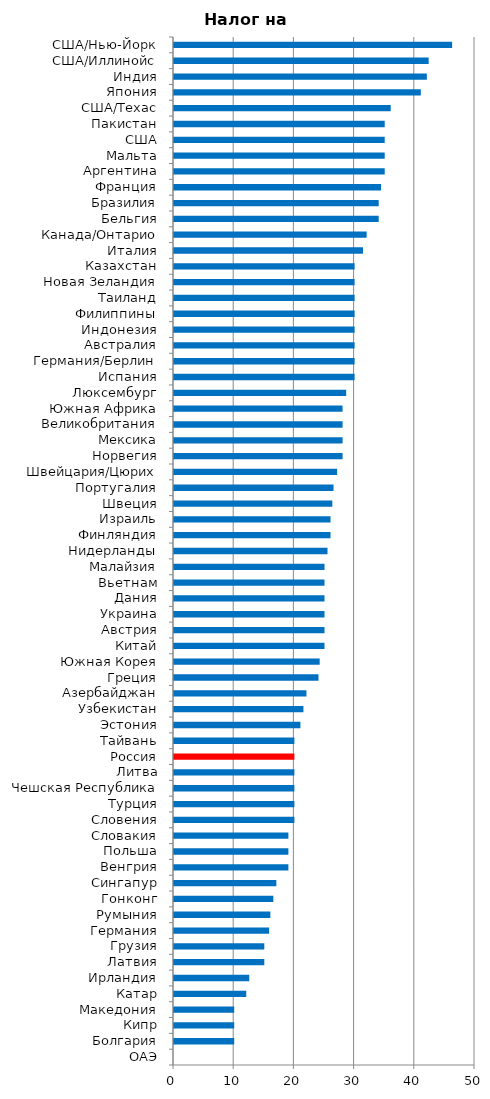
| Category | Налог на прибыль |
|---|---|
| ОАЭ | 0 |
| Болгария | 10 |
| Кипр | 10 |
| Македония | 10 |
| Катар | 12 |
| Ирландия | 12.5 |
| Латвия | 15 |
| Грузия | 15 |
| Германия | 15.8 |
| Румыния | 16 |
| Гонконг | 16.5 |
| Сингапур | 17 |
| Венгрия | 19 |
| Польша | 19 |
| Словакия | 19 |
| Словения | 20 |
| Турция | 20 |
| Чешская Республика | 20 |
| Литва | 20 |
| Россия | 20 |
| Тайвань | 20 |
| Эстония | 21 |
| Узбекистан | 21.5 |
| Азербайджан | 22 |
| Греция | 24 |
| Южная Корея | 24.2 |
| Китай | 25 |
| Австрия | 25 |
| Украина | 25 |
| Дания | 25 |
| Вьетнам | 25 |
| Малайзия | 25 |
| Нидерланды | 25.5 |
| Финляндия | 26 |
| Израиль | 26 |
| Швеция | 26.3 |
| Португалия | 26.5 |
| Швейцария/Цюрих | 27.1 |
| Норвегия | 28 |
| Мексика | 28 |
| Великобритания | 28 |
| Южная Африка | 28 |
| Люксембург | 28.6 |
| Испания | 30 |
| Германия/Берлин | 30 |
| Австралия | 30 |
| Индонезия | 30 |
| Филиппины | 30 |
| Таиланд | 30 |
| Новая Зеландия | 30 |
| Казахстан | 30 |
| Италия | 31.4 |
| Канада/Онтарио | 32 |
| Бельгия | 34 |
| Бразилия | 34 |
| Франция | 34.4 |
| Аргентина | 35 |
| Мальта | 35 |
| США | 35 |
| Пакистан | 35 |
| США/Техас | 36 |
| Япония | 41 |
| Индия | 42 |
| США/Иллинойс | 42.3 |
| США/Нью-Йорк | 46.2 |